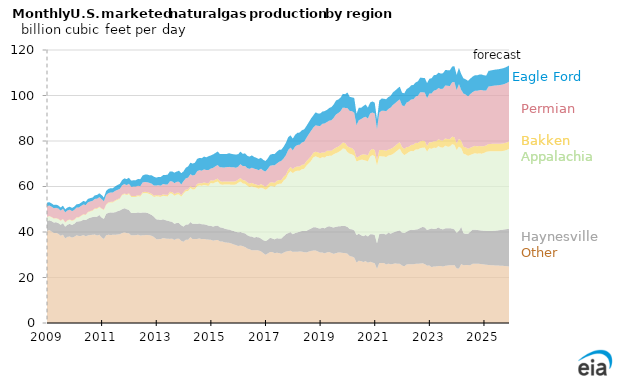
| Category | Other | Haynesville | Appalachia | Bakken | Permian | Eagle Ford |
|---|---|---|---|---|---|---|
| 2009-01-01 | 40.419 | 4.409 | 1.696 | 0.138 | 4.677 | 1.537 |
| 2009-02-01 | 40.871 | 4.271 | 1.755 | 0.144 | 4.592 | 1.482 |
| 2009-03-01 | 40.235 | 4.517 | 1.696 | 0.149 | 4.517 | 1.462 |
| 2009-04-01 | 39.585 | 4.593 | 1.681 | 0.169 | 4.441 | 1.43 |
| 2009-05-01 | 39.611 | 4.671 | 1.667 | 0.164 | 4.52 | 1.393 |
| 2009-06-01 | 39.165 | 4.758 | 1.7 | 0.167 | 4.496 | 1.368 |
| 2009-07-01 | 38.339 | 4.836 | 1.68 | 0.175 | 4.37 | 1.35 |
| 2009-08-01 | 38.821 | 5.077 | 1.708 | 0.179 | 4.41 | 1.385 |
| 2009-09-01 | 37.143 | 5.208 | 1.742 | 0.18 | 4.397 | 1.321 |
| 2009-10-01 | 37.859 | 5.379 | 1.749 | 0.18 | 4.283 | 1.301 |
| 2009-11-01 | 38.017 | 5.571 | 1.734 | 0.187 | 4.302 | 1.306 |
| 2009-12-01 | 37.533 | 5.555 | 1.761 | 0.202 | 4.156 | 1.362 |
| 2010-01-01 | 37.899 | 5.738 | 1.644 | 0.194 | 4.227 | 1.445 |
| 2010-02-01 | 38.556 | 6.024 | 1.652 | 0.202 | 4.303 | 1.5 |
| 2010-03-01 | 38.265 | 6.419 | 1.645 | 0.21 | 4.256 | 1.473 |
| 2010-04-01 | 38.284 | 6.544 | 2.186 | 0.218 | 4.255 | 1.435 |
| 2010-05-01 | 38.672 | 6.757 | 2.187 | 0.229 | 4.3 | 1.521 |
| 2010-06-01 | 38.109 | 7.124 | 2.197 | 0.215 | 4.171 | 1.478 |
| 2010-07-01 | 38.493 | 7.402 | 2.691 | 0.243 | 4.231 | 1.509 |
| 2010-08-01 | 38.695 | 7.606 | 2.695 | 0.23 | 4.183 | 1.483 |
| 2010-09-01 | 38.752 | 7.815 | 2.711 | 0.256 | 4.144 | 1.476 |
| 2010-10-01 | 38.885 | 7.836 | 3.41 | 0.249 | 4.168 | 1.561 |
| 2010-11-01 | 38.469 | 8.272 | 3.424 | 0.257 | 4.184 | 1.674 |
| 2010-12-01 | 38.802 | 8.664 | 3.413 | 0.247 | 4.198 | 1.716 |
| 2011-01-01 | 37.636 | 8.702 | 3.788 | 0.243 | 4.078 | 1.783 |
| 2011-02-01 | 36.941 | 8.846 | 3.841 | 0.237 | 3.632 | 1.706 |
| 2011-03-01 | 38.57 | 9.441 | 3.88 | 0.248 | 4.15 | 1.784 |
| 2011-04-01 | 38.766 | 9.661 | 4.374 | 0.247 | 4.027 | 1.866 |
| 2011-05-01 | 38.681 | 9.949 | 4.385 | 0.25 | 4.118 | 1.884 |
| 2011-06-01 | 38.771 | 9.81 | 4.435 | 0.261 | 4.134 | 1.873 |
| 2011-07-01 | 38.729 | 9.96 | 4.996 | 0.288 | 4.138 | 1.971 |
| 2011-08-01 | 38.931 | 10.226 | 4.984 | 0.301 | 4.099 | 2.126 |
| 2011-09-01 | 38.992 | 10.478 | 5.084 | 0.305 | 4.078 | 2.221 |
| 2011-10-01 | 39.514 | 10.491 | 6.13 | 0.323 | 4.062 | 2.309 |
| 2011-11-01 | 39.83 | 10.652 | 6.132 | 0.334 | 4.115 | 2.531 |
| 2011-12-01 | 39.516 | 10.508 | 6.18 | 0.344 | 4.066 | 2.652 |
| 2012-01-01 | 39.423 | 10.257 | 7.024 | 0.385 | 4.092 | 2.665 |
| 2012-02-01 | 38.503 | 9.858 | 7.041 | 0.404 | 4.093 | 2.682 |
| 2012-03-01 | 38.62 | 9.777 | 7.009 | 0.423 | 4.14 | 2.779 |
| 2012-04-01 | 38.623 | 9.759 | 7.041 | 0.432 | 4.16 | 2.754 |
| 2012-05-01 | 38.791 | 9.823 | 7.127 | 0.477 | 4.098 | 2.985 |
| 2012-06-01 | 38.421 | 10.01 | 7.13 | 0.487 | 4.101 | 3.053 |
| 2012-07-01 | 38.585 | 9.969 | 8.427 | 0.504 | 4.268 | 3.077 |
| 2012-08-01 | 38.615 | 9.964 | 8.534 | 0.551 | 4.306 | 3.25 |
| 2012-09-01 | 38.67 | 9.778 | 8.553 | 0.566 | 4.318 | 3.387 |
| 2012-10-01 | 38.597 | 9.415 | 8.673 | 0.571 | 4.361 | 3.329 |
| 2012-11-01 | 38.339 | 9.16 | 8.703 | 0.57 | 4.456 | 3.681 |
| 2012-12-01 | 37.799 | 8.881 | 8.684 | 0.594 | 4.433 | 3.907 |
| 2013-01-01 | 36.856 | 8.73 | 10.09 | 0.577 | 4.213 | 3.44 |
| 2013-02-01 | 36.852 | 8.636 | 10.093 | 0.597 | 4.385 | 3.614 |
| 2013-03-01 | 36.899 | 8.357 | 10.167 | 0.618 | 4.314 | 3.786 |
| 2013-04-01 | 37.36 | 8.235 | 10.325 | 0.626 | 4.591 | 3.883 |
| 2013-05-01 | 37.14 | 8.097 | 10.497 | 0.648 | 4.526 | 4.123 |
| 2013-06-01 | 37.022 | 7.923 | 10.66 | 0.686 | 4.602 | 4.317 |
| 2013-07-01 | 36.965 | 7.719 | 12.282 | 0.694 | 4.61 | 4.338 |
| 2013-08-01 | 37.027 | 7.445 | 12.363 | 0.726 | 4.687 | 4.374 |
| 2013-09-01 | 36.513 | 7.06 | 12.358 | 0.77 | 4.775 | 4.593 |
| 2013-10-01 | 37.044 | 6.964 | 12.43 | 0.788 | 4.814 | 4.522 |
| 2013-11-01 | 37.029 | 6.92 | 12.599 | 0.774 | 4.748 | 4.875 |
| 2013-12-01 | 36.095 | 6.846 | 12.584 | 0.656 | 4.723 | 4.953 |
| 2014-01-01 | 35.718 | 6.702 | 14.489 | 0.665 | 4.823 | 4.292 |
| 2014-02-01 | 36.587 | 6.687 | 14.666 | 0.701 | 4.933 | 4.685 |
| 2014-03-01 | 36.604 | 6.64 | 14.759 | 0.744 | 5.181 | 4.904 |
| 2014-04-01 | 37.731 | 6.634 | 14.976 | 0.817 | 5.258 | 5.056 |
| 2014-05-01 | 36.858 | 6.733 | 15.058 | 0.879 | 5.32 | 5.208 |
| 2014-06-01 | 36.913 | 6.735 | 15.13 | 0.913 | 5.434 | 5.353 |
| 2014-07-01 | 36.948 | 6.606 | 16.63 | 0.971 | 5.587 | 5.424 |
| 2014-08-01 | 37.182 | 6.576 | 16.731 | 0.998 | 5.692 | 5.382 |
| 2014-09-01 | 36.847 | 6.592 | 16.88 | 1.078 | 5.543 | 5.501 |
| 2014-10-01 | 36.94 | 6.474 | 17.284 | 1.126 | 5.715 | 5.628 |
| 2014-11-01 | 36.721 | 6.431 | 17.28 | 1.085 | 5.712 | 5.604 |
| 2014-12-01 | 36.642 | 6.153 | 17.491 | 1.159 | 5.788 | 6.094 |
| 2015-01-01 | 36.577 | 6.133 | 18.874 | 1.153 | 5.16 | 5.749 |
| 2015-02-01 | 36.181 | 6.187 | 18.94 | 1.205 | 5.685 | 5.924 |
| 2015-03-01 | 36.411 | 6.29 | 19.158 | 1.233 | 5.802 | 5.848 |
| 2015-04-01 | 36.492 | 6.314 | 19.353 | 1.276 | 5.998 | 5.952 |
| 2015-05-01 | 35.867 | 6.199 | 18.999 | 1.341 | 6.072 | 5.788 |
| 2015-06-01 | 35.856 | 6.033 | 18.847 | 1.363 | 6.308 | 5.828 |
| 2015-07-01 | 35.458 | 6.069 | 19.364 | 1.342 | 6.137 | 5.87 |
| 2015-08-01 | 35.343 | 5.861 | 19.725 | 1.317 | 6.275 | 5.77 |
| 2015-09-01 | 35.236 | 5.857 | 19.8 | 1.318 | 6.421 | 6.017 |
| 2015-10-01 | 34.94 | 5.787 | 20.031 | 1.435 | 6.259 | 5.896 |
| 2015-11-01 | 34.556 | 5.88 | 20.296 | 1.425 | 6.333 | 5.676 |
| 2015-12-01 | 34.23 | 5.838 | 20.832 | 1.435 | 5.862 | 5.85 |
| 2016-01-01 | 33.842 | 6.001 | 21.766 | 1.435 | 5.698 | 5.451 |
| 2016-02-01 | 34.032 | 5.965 | 22.199 | 1.509 | 6.086 | 5.557 |
| 2016-03-01 | 33.784 | 5.79 | 21.724 | 1.55 | 6.182 | 5.32 |
| 2016-04-01 | 33.395 | 6.04 | 21.744 | 1.493 | 6.353 | 5.557 |
| 2016-05-01 | 32.735 | 5.906 | 21.696 | 1.465 | 6.309 | 5.391 |
| 2016-06-01 | 32.389 | 5.73 | 21.643 | 1.502 | 6.47 | 5.389 |
| 2016-07-01 | 31.982 | 6.009 | 22.081 | 1.519 | 6.656 | 5.445 |
| 2016-08-01 | 31.974 | 5.582 | 22.126 | 1.448 | 6.716 | 5.143 |
| 2016-09-01 | 31.986 | 5.783 | 21.692 | 1.43 | 6.693 | 5.023 |
| 2016-10-01 | 31.887 | 5.786 | 21.297 | 1.473 | 6.741 | 4.917 |
| 2016-11-01 | 31.507 | 5.637 | 22.34 | 1.581 | 6.749 | 4.81 |
| 2016-12-01 | 30.741 | 5.707 | 22.703 | 1.334 | 6.552 | 4.677 |
| 2017-01-01 | 30.001 | 5.996 | 22.535 | 1.374 | 6.683 | 4.598 |
| 2017-02-01 | 30.534 | 5.989 | 22.606 | 1.538 | 7.065 | 4.613 |
| 2017-03-01 | 31.161 | 6.298 | 22.762 | 1.561 | 7.327 | 4.841 |
| 2017-04-01 | 31.183 | 5.962 | 23.044 | 1.653 | 7.461 | 4.994 |
| 2017-05-01 | 30.678 | 6.104 | 23.137 | 1.664 | 7.73 | 4.971 |
| 2017-06-01 | 30.873 | 6.428 | 23.528 | 1.643 | 7.664 | 5.152 |
| 2017-07-01 | 30.73 | 6.372 | 24.089 | 1.683 | 7.977 | 5.256 |
| 2017-08-01 | 30.385 | 6.799 | 24.02 | 1.698 | 8.39 | 4.92 |
| 2017-09-01 | 30.951 | 7.175 | 24.523 | 1.641 | 8.099 | 5.156 |
| 2017-10-01 | 31.402 | 7.635 | 24.459 | 1.726 | 8.603 | 5.463 |
| 2017-11-01 | 31.593 | 7.933 | 26.047 | 1.824 | 8.7 | 5.594 |
| 2017-12-01 | 31.752 | 8.169 | 26.83 | 1.82 | 8.551 | 5.365 |
| 2018-01-01 | 31.235 | 7.799 | 26.822 | 1.771 | 8.265 | 5.159 |
| 2018-02-01 | 31.358 | 8.142 | 27.147 | 1.853 | 9.037 | 5.143 |
| 2018-03-01 | 31.31 | 8.495 | 27.124 | 1.868 | 9.432 | 5.408 |
| 2018-04-01 | 31.447 | 8.673 | 26.784 | 1.898 | 9.579 | 5.32 |
| 2018-05-01 | 31.355 | 9.082 | 27.162 | 1.92 | 9.827 | 5.391 |
| 2018-06-01 | 31.11 | 9.309 | 27.358 | 1.915 | 10.019 | 5.422 |
| 2018-07-01 | 31.019 | 9.459 | 28.649 | 1.977 | 10.26 | 5.24 |
| 2018-08-01 | 31.373 | 9.687 | 29.096 | 2.027 | 10.771 | 5.274 |
| 2018-09-01 | 31.674 | 9.826 | 29.695 | 2.092 | 11.156 | 5.438 |
| 2018-10-01 | 31.835 | 10.251 | 30.678 | 2.056 | 11.049 | 5.365 |
| 2018-11-01 | 31.887 | 10.239 | 31.127 | 2.015 | 11.625 | 5.7 |
| 2018-12-01 | 31.453 | 10.274 | 31.179 | 2.155 | 11.613 | 5.465 |
| 2019-01-01 | 30.955 | 10.559 | 30.909 | 2.214 | 11.96 | 5.471 |
| 2019-02-01 | 30.979 | 10.941 | 30.958 | 2.12 | 12.541 | 5.378 |
| 2019-03-01 | 30.6 | 11.003 | 31.067 | 2.242 | 12.806 | 5.423 |
| 2019-04-01 | 31.021 | 11.238 | 31.18 | 2.301 | 12.579 | 5.339 |
| 2019-05-01 | 31.206 | 11.369 | 30.89 | 2.304 | 13.168 | 5.565 |
| 2019-06-01 | 30.763 | 11.425 | 31.303 | 2.22 | 13.406 | 5.808 |
| 2019-07-01 | 30.375 | 11.613 | 32.219 | 2.295 | 13.721 | 5.888 |
| 2019-08-01 | 30.716 | 11.592 | 32.337 | 2.463 | 14.579 | 6.126 |
| 2019-09-01 | 30.994 | 11.501 | 32.585 | 2.451 | 14.764 | 5.967 |
| 2019-10-01 | 30.937 | 11.636 | 33.164 | 2.55 | 14.873 | 5.938 |
| 2019-11-01 | 30.795 | 11.851 | 34.09 | 2.618 | 15.322 | 6.055 |
| 2019-12-01 | 30.712 | 11.936 | 33.84 | 2.589 | 15.471 | 6.019 |
| 2020-01-01 | 30.485 | 11.753 | 32.88 | 2.588 | 16.742 | 6.884 |
| 2020-02-01 | 29.396 | 11.895 | 33.106 | 2.735 | 16.088 | 6.197 |
| 2020-03-01 | 29.216 | 11.987 | 32.935 | 2.754 | 16.223 | 6.069 |
| 2020-04-01 | 28.757 | 11.987 | 32.761 | 2.438 | 16.435 | 6.555 |
| 2020-05-01 | 26.542 | 12.135 | 32.347 | 1.729 | 14.206 | 5.009 |
| 2020-06-01 | 27.374 | 11.861 | 32.175 | 1.781 | 15.939 | 5.5 |
| 2020-07-01 | 27.189 | 11.417 | 33.124 | 2.135 | 15.749 | 4.963 |
| 2020-08-01 | 26.803 | 11.338 | 33.558 | 2.46 | 16.129 | 5.081 |
| 2020-09-01 | 27.21 | 11.474 | 32.692 | 2.64 | 16.647 | 5.371 |
| 2020-10-01 | 26.507 | 11.545 | 32.989 | 2.707 | 16.143 | 4.847 |
| 2020-11-01 | 26.916 | 12.148 | 34.086 | 2.714 | 16.252 | 4.813 |
| 2020-12-01 | 26.6 | 12.391 | 34.826 | 2.734 | 15.985 | 4.839 |
| 2021-01-01 | 26.222 | 12.5 | 34.565 | 2.717 | 16.081 | 4.754 |
| 2021-02-01 | 23.809 | 11.202 | 34.212 | 2.538 | 13.385 | 4.307 |
| 2021-03-01 | 26.335 | 12.748 | 34.189 | 2.719 | 16.478 | 5.28 |
| 2021-04-01 | 26.316 | 12.902 | 34.023 | 2.793 | 17.271 | 5.339 |
| 2021-05-01 | 26.413 | 12.812 | 33.973 | 2.782 | 17.321 | 5.31 |
| 2021-06-01 | 25.711 | 13.153 | 34.074 | 2.776 | 17.408 | 5.213 |
| 2021-07-01 | 26.088 | 13.673 | 33.851 | 2.612 | 17.843 | 5.235 |
| 2021-08-01 | 25.808 | 13.446 | 34.555 | 2.752 | 18.131 | 5.195 |
| 2021-09-01 | 25.947 | 13.786 | 34.493 | 2.872 | 18.75 | 5.514 |
| 2021-10-01 | 26.221 | 13.885 | 34.945 | 2.858 | 18.733 | 5.548 |
| 2021-11-01 | 26.017 | 14.416 | 35.379 | 2.938 | 18.782 | 5.553 |
| 2021-12-01 | 26.022 | 14.661 | 35.958 | 2.861 | 18.791 | 5.636 |
| 2022-01-01 | 25.269 | 14.493 | 34.946 | 2.656 | 18.33 | 5.536 |
| 2022-02-01 | 24.895 | 14.638 | 34.265 | 2.741 | 18.727 | 5.721 |
| 2022-03-01 | 25.725 | 14.357 | 34.343 | 2.875 | 19.611 | 5.846 |
| 2022-04-01 | 25.835 | 14.893 | 34.405 | 2.321 | 19.952 | 6.015 |
| 2022-05-01 | 25.812 | 15.167 | 34.639 | 2.652 | 20.006 | 6.187 |
| 2022-06-01 | 25.822 | 15.046 | 34.641 | 2.915 | 19.893 | 6.327 |
| 2022-07-01 | 26.011 | 15.09 | 35.13 | 2.948 | 20.381 | 6.214 |
| 2022-08-01 | 26.041 | 15.202 | 34.981 | 2.934 | 20.738 | 6.389 |
| 2022-09-01 | 26.12 | 15.682 | 35.042 | 3.06 | 21.521 | 6.442 |
| 2022-10-01 | 26.257 | 15.996 | 34.81 | 3.042 | 21.357 | 6.284 |
| 2022-11-01 | 25.875 | 16.133 | 35.086 | 2.889 | 21.295 | 6.422 |
| 2022-12-01 | 25.207 | 15.677 | 34.465 | 2.498 | 20.997 | 6.63 |
| 2023-01-01 | 25.292 | 15.963 | 35.543 | 2.709 | 21.318 | 6.513 |
| 2023-02-01 | 24.525 | 17.052 | 34.975 | 2.905 | 21.461 | 6.667 |
| 2023-03-01 | 24.875 | 16.402 | 35.76 | 2.884 | 22.225 | 6.795 |
| 2023-04-01 | 24.876 | 16.607 | 35.443 | 2.956 | 22.524 | 6.661 |
| 2023-05-01 | 25.03 | 16.991 | 35.728 | 2.997 | 22.544 | 6.778 |
| 2023-06-01 | 25.093 | 16.282 | 35.795 | 3.121 | 22.572 | 6.776 |
| 2023-07-01 | 24.799 | 16.382 | 35.883 | 3.174 | 22.755 | 6.784 |
| 2023-08-01 | 25.132 | 16.469 | 36.339 | 3.201 | 23.274 | 6.772 |
| 2023-09-01 | 25.271 | 16.425 | 35.813 | 3.325 | 23.428 | 6.877 |
| 2023-10-01 | 25.397 | 16.26 | 35.882 | 3.281 | 23.361 | 6.891 |
| 2023-11-01 | 25.339 | 16.189 | 37.058 | 3.323 | 23.896 | 6.887 |
| 2023-12-01 | 25.453 | 15.69 | 37.137 | 3.388 | 24.295 | 6.927 |
| 2024-01-01 | 24.026 | 15.619 | 36.387 | 2.94 | 23.416 | 6.688 |
| 2024-02-01 | 23.918 | 16.628 | 36.98 | 3.452 | 24.044 | 7.174 |
| 2024-03-01 | 25.883 | 16.367 | 34.594 | 3.22 | 22.417 | 6.991 |
| 2024-04-01 | 25.413 | 14.043 | 34.917 | 3.111 | 23.369 | 6.7 |
| 2024-05-01 | 25.451 | 13.753 | 34.837 | 3.142 | 23.198 | 6.734 |
| 2024-06-01 | 25.444 | 13.795 | 34.208 | 3.175 | 23.048 | 6.778 |
| 2024-07-01 | 25.41 | 14.713 | 33.726 | 3.206 | 23.559 | 6.812 |
| 2024-08-01 | 26.032 | 14.989 | 33.233 | 3.232 | 23.999 | 6.825 |
| 2024-09-01 | 26.07 | 14.973 | 33.566 | 3.252 | 24.19 | 6.83 |
| 2024-10-01 | 25.994 | 14.877 | 33.539 | 3.261 | 24.371 | 6.839 |
| 2024-11-01 | 25.998 | 14.8 | 33.755 | 3.253 | 24.553 | 6.853 |
| 2024-12-01 | 25.873 | 14.755 | 33.784 | 3.228 | 24.729 | 6.864 |
| 2025-01-01 | 25.734 | 14.841 | 34.164 | 3.014 | 24.427 | 6.69 |
| 2025-02-01 | 25.609 | 14.859 | 34.74 | 2.86 | 24.161 | 6.578 |
| 2025-03-01 | 25.505 | 14.912 | 35.005 | 3.245 | 25.291 | 6.868 |
| 2025-04-01 | 25.419 | 15.009 | 35.036 | 3.243 | 25.381 | 6.895 |
| 2025-05-01 | 25.357 | 15.136 | 35.052 | 3.253 | 25.483 | 6.944 |
| 2025-06-01 | 25.303 | 15.284 | 34.949 | 3.269 | 25.586 | 6.986 |
| 2025-07-01 | 25.252 | 15.453 | 34.801 | 3.286 | 25.689 | 7.023 |
| 2025-08-01 | 25.204 | 15.64 | 34.664 | 3.302 | 25.799 | 7.054 |
| 2025-09-01 | 25.15 | 15.845 | 34.565 | 3.313 | 25.911 | 7.079 |
| 2025-10-01 | 25.079 | 16.066 | 34.587 | 3.314 | 26.024 | 7.101 |
| 2025-11-01 | 24.981 | 16.303 | 34.77 | 3.303 | 26.142 | 7.12 |
| 2025-12-01 | 24.849 | 16.552 | 35.1 | 3.277 | 26.256 | 7.134 |